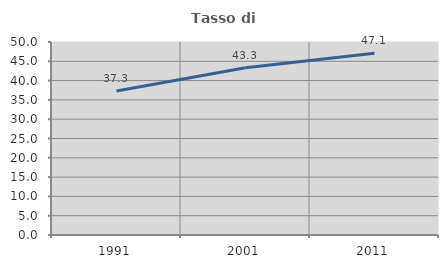
| Category | Tasso di occupazione   |
|---|---|
| 1991.0 | 37.313 |
| 2001.0 | 43.305 |
| 2011.0 | 47.087 |